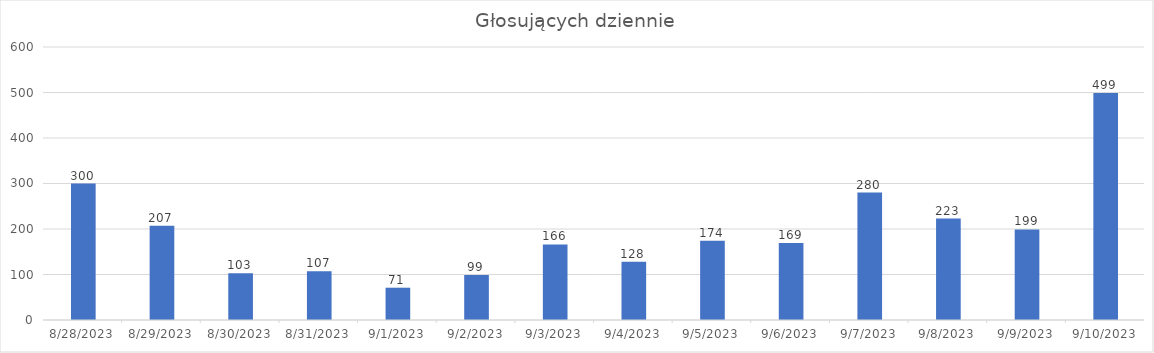
| Category | Series 0 |
|---|---|
| 8/28/23 | 300 |
| 8/29/23 | 207 |
| 8/30/23 | 103 |
| 8/31/23 | 107 |
| 9/1/23 | 71 |
| 9/2/23 | 99 |
| 9/3/23 | 166 |
| 9/4/23 | 128 |
| 9/5/23 | 174 |
| 9/6/23 | 169 |
| 9/7/23 | 280 |
| 9/8/23 | 223 |
| 9/9/23 | 199 |
| 9/10/23 | 499 |